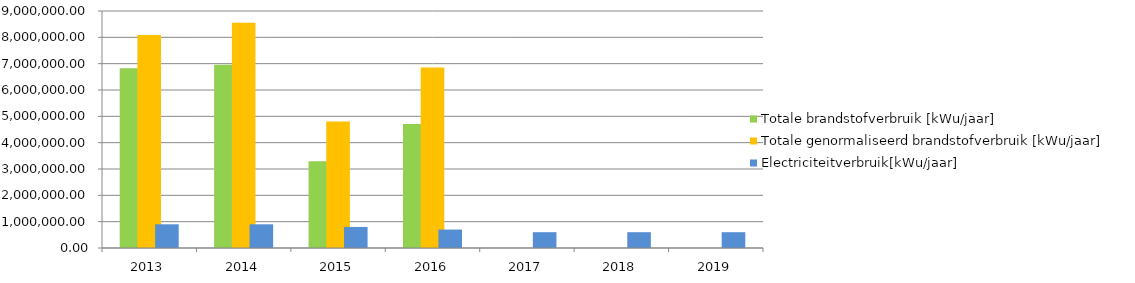
| Category | Totale brandstofverbruik [kWu/jaar]
 | Totale genormaliseerd brandstofverbruik [kWu/jaar]
 | Electriciteitverbruik[kWu/jaar]
 |
|---|---|---|---|
| 2013 | 6828125.595 | 8087034.483 | 900000 |
| 2014 | 6958264.91 | 8555044.258 | 900000 |
| 2015 | 3295516.313 | 4801013.366 | 800000 |
| 2016 | 4707691.75 | 6858315.623 | 700000 |
| 2017 | 0 | 0 | 600000 |
| 2018 | 0 | 0 | 600000 |
| 2019 | 0 | 0 | 600000 |